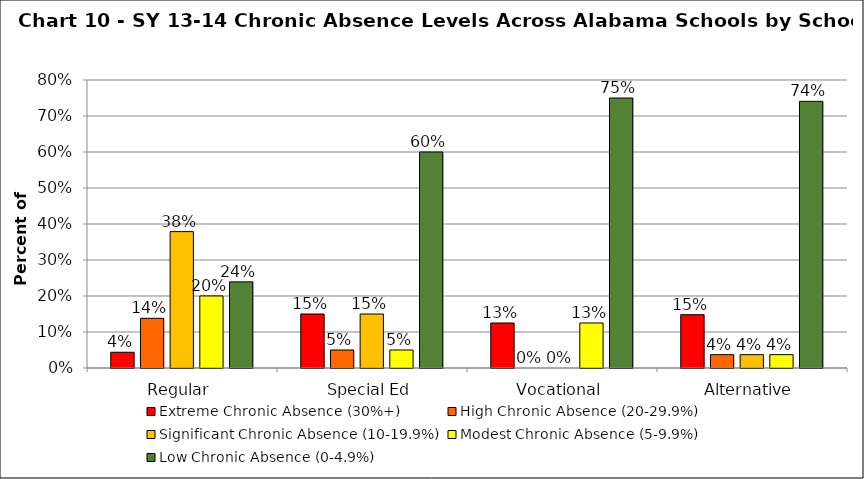
| Category | Extreme Chronic Absence (30%+) | High Chronic Absence (20-29.9%) | Significant Chronic Absence (10-19.9%) | Modest Chronic Absence (5-9.9%) | Low Chronic Absence (0-4.9%) |
|---|---|---|---|---|---|
| 0 | 0.044 | 0.138 | 0.379 | 0.2 | 0.239 |
| 1 | 0.15 | 0.05 | 0.15 | 0.05 | 0.6 |
| 2 | 0.125 | 0 | 0 | 0.125 | 0.75 |
| 3 | 0.148 | 0.037 | 0.037 | 0.037 | 0.741 |